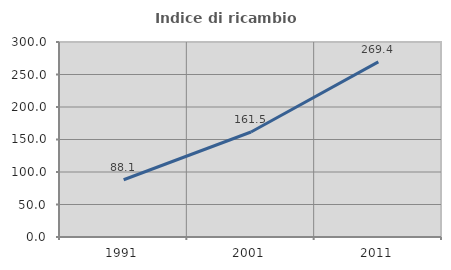
| Category | Indice di ricambio occupazionale  |
|---|---|
| 1991.0 | 88.087 |
| 2001.0 | 161.508 |
| 2011.0 | 269.432 |